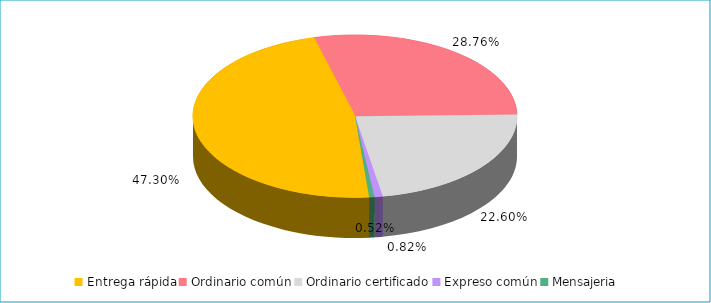
| Category | Series 0 |
|---|---|
| Entrega rápida | 0.473 |
| Ordinario común | 0.288 |
| Ordinario certificado | 0.226 |
| Expreso común | 0.008 |
| Mensajeria | 0.005 |